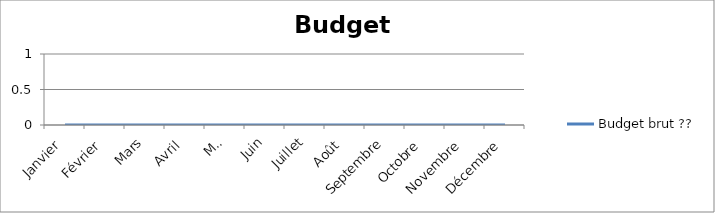
| Category | Budget brut ?? |
|---|---|
| Janvier | 0 |
| Février | 0 |
| Mars | 0 |
| Avril | 0 |
| Mai | 0 |
| Juin | 0 |
| Juillet | 0 |
| Août | 0 |
| Septembre | 0 |
| Octobre | 0 |
| Novembre | 0 |
| Décembre | 0 |